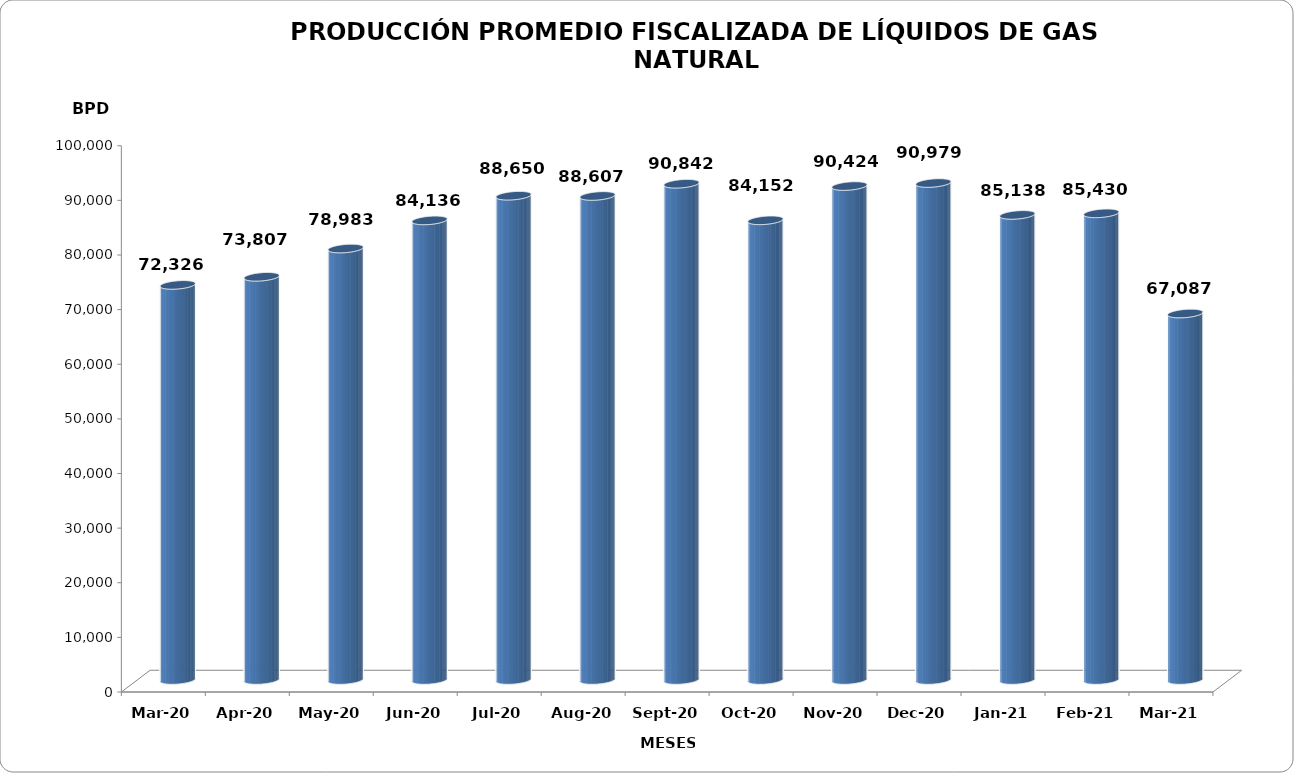
| Category | Series 0 |
|---|---|
| 2020-03-01 | 72326 |
| 2020-04-01 | 73807 |
| 2020-05-01 | 78983 |
| 2020-06-01 | 84136 |
| 2020-07-01 | 88650 |
| 2020-08-01 | 88607 |
| 2020-09-01 | 90842 |
| 2020-10-01 | 84152 |
| 2020-11-01 | 90424 |
| 2020-12-01 | 90979 |
| 2021-01-01 | 85138 |
| 2021-02-01 | 85430 |
| 2021-03-01 | 67087 |